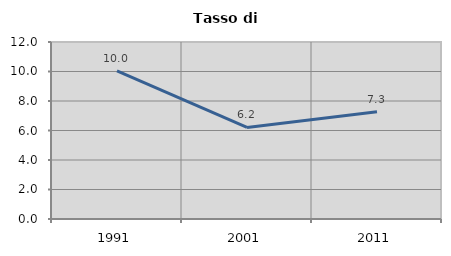
| Category | Tasso di disoccupazione   |
|---|---|
| 1991.0 | 10.036 |
| 2001.0 | 6.207 |
| 2011.0 | 7.273 |